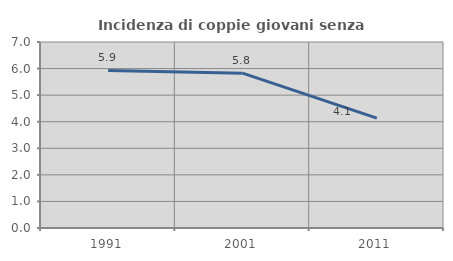
| Category | Incidenza di coppie giovani senza figli |
|---|---|
| 1991.0 | 5.928 |
| 2001.0 | 5.829 |
| 2011.0 | 4.137 |